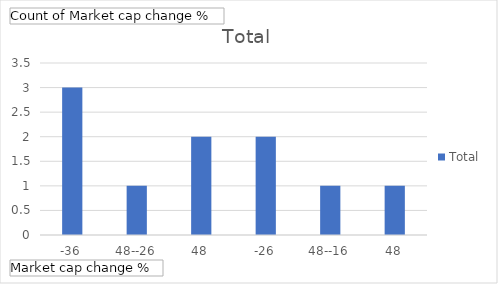
| Category | Total |
|---|---|
| -36,48--26,48 | 3 |
| -26,48--16,48 | 1 |
| 3,52-13,52 | 2 |
| 13,52-23,52 | 2 |
| 43,52-53,52 | 1 |
| 63,52-73,52 | 1 |